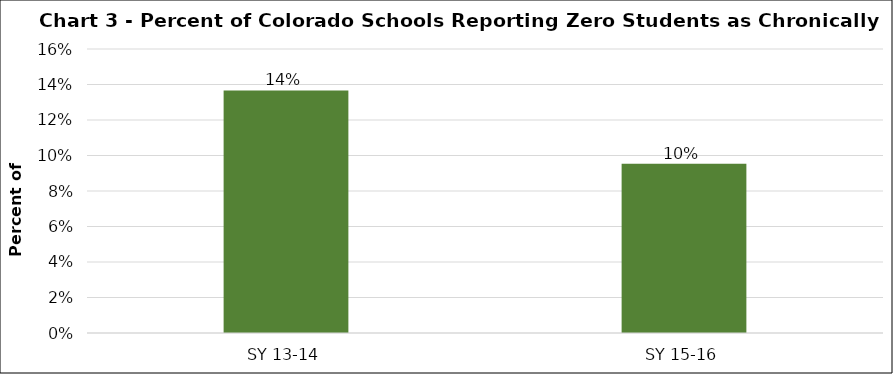
| Category | Series 0 |
|---|---|
| SY 13-14 | 0.137 |
| SY 15-16 | 0.095 |